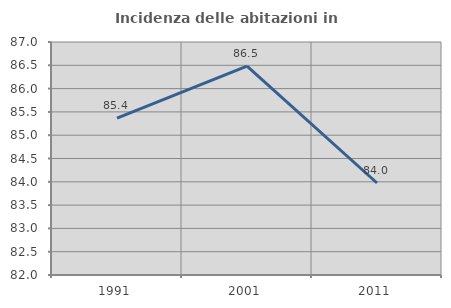
| Category | Incidenza delle abitazioni in proprietà  |
|---|---|
| 1991.0 | 85.365 |
| 2001.0 | 86.482 |
| 2011.0 | 83.974 |